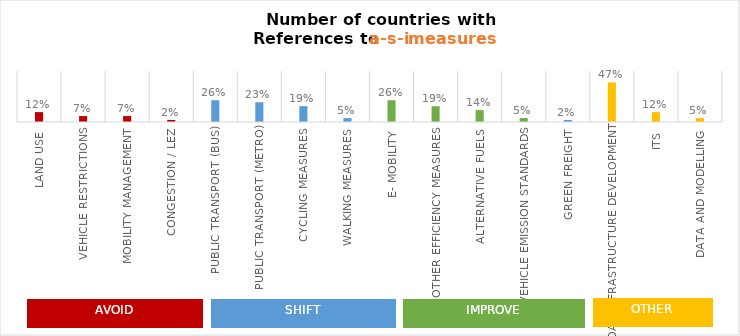
| Category | Series 0 |
|---|---|
| Land Use | 0.116 |
| Vehicle Restrictions | 0.07 |
| Mobility Management | 0.07 |
| Congestion / LEZ | 0.023 |
| Public Transport (Bus) | 0.256 |
| Public Transport (Metro) | 0.233 |
| Cycling Measures | 0.186 |
| Walking Measures | 0.047 |
| E- mobility | 0.256 |
| Other Efficiency Measures | 0.186 |
| Alternative Fuels | 0.14 |
| Vehicle Emission Standards | 0.047 |
| Green Freight | 0.023 |
| Road Infrastructure Development | 0.465 |
| ITS | 0.116 |
| Data and Modelling | 0.047 |